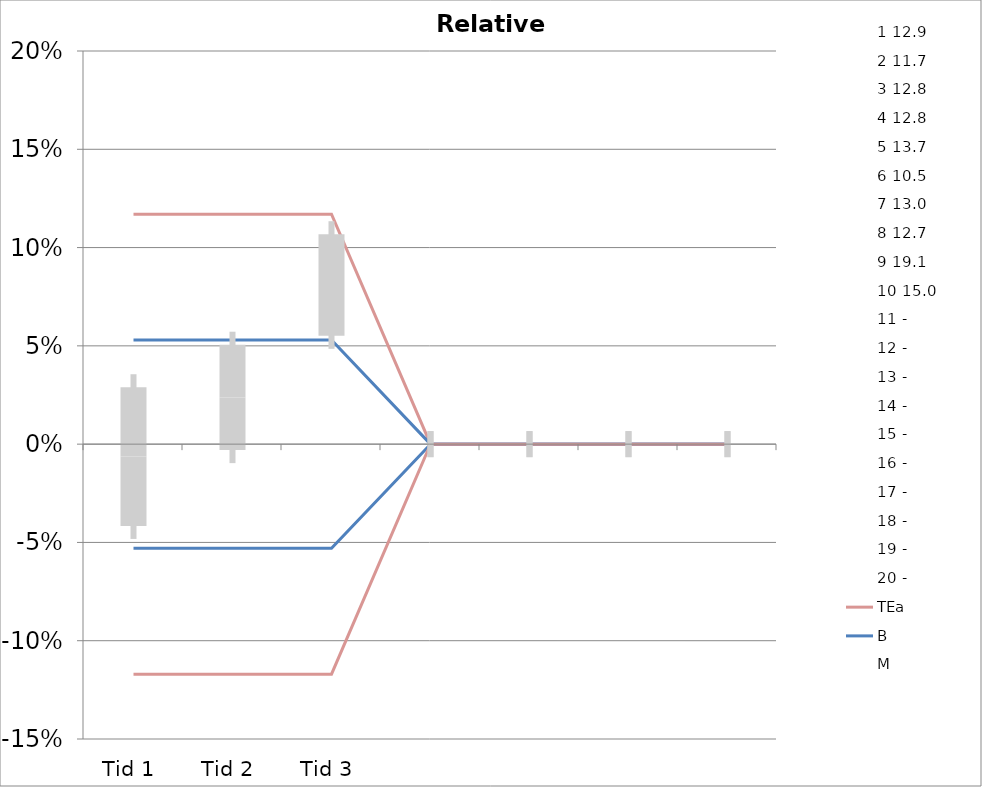
| Category | 1 | 2 | 3 | 4 | 5 | 6 | 7 | 8 | 9 | 10 | 11 | 12 | 13 | 14 | 15 | 16 | 17 | 18 | 19 | 20 | TEa | B | -B | -TEa | M |
|---|---|---|---|---|---|---|---|---|---|---|---|---|---|---|---|---|---|---|---|---|---|---|---|---|---|
| Tid 1 | 0.008 | -0.094 | 0.031 | -0.039 | -0.073 | 0.038 | 0.038 | 0.047 | 0 | -0.02 | 0 | 0 | 0 | 0 | 0 | 0 | 0 | 0 | 0 | 0 | 0.117 | 0.053 | -0.053 | -0.117 | -0.006 |
| Tid 2 | 0.047 | -0.051 | 0.016 | 0.008 | -0.022 | 0.057 | 0.062 | 0.055 | 0.047 | 0.02 | 0 | 0 | 0 | 0 | 0 | 0 | 0 | 0 | 0 | 0 | 0.117 | 0.053 | -0.053 | -0.117 | 0.024 |
| Tid 3 | 0.07 | 0.034 | 0.047 | 0.062 | 0.058 | 0.152 | 0.123 | 0.102 | 0.073 | 0.087 | 0 | 0 | 0 | 0 | 0 | 0 | 0 | 0 | 0 | 0 | 0.117 | 0.053 | -0.053 | -0.117 | 0.081 |